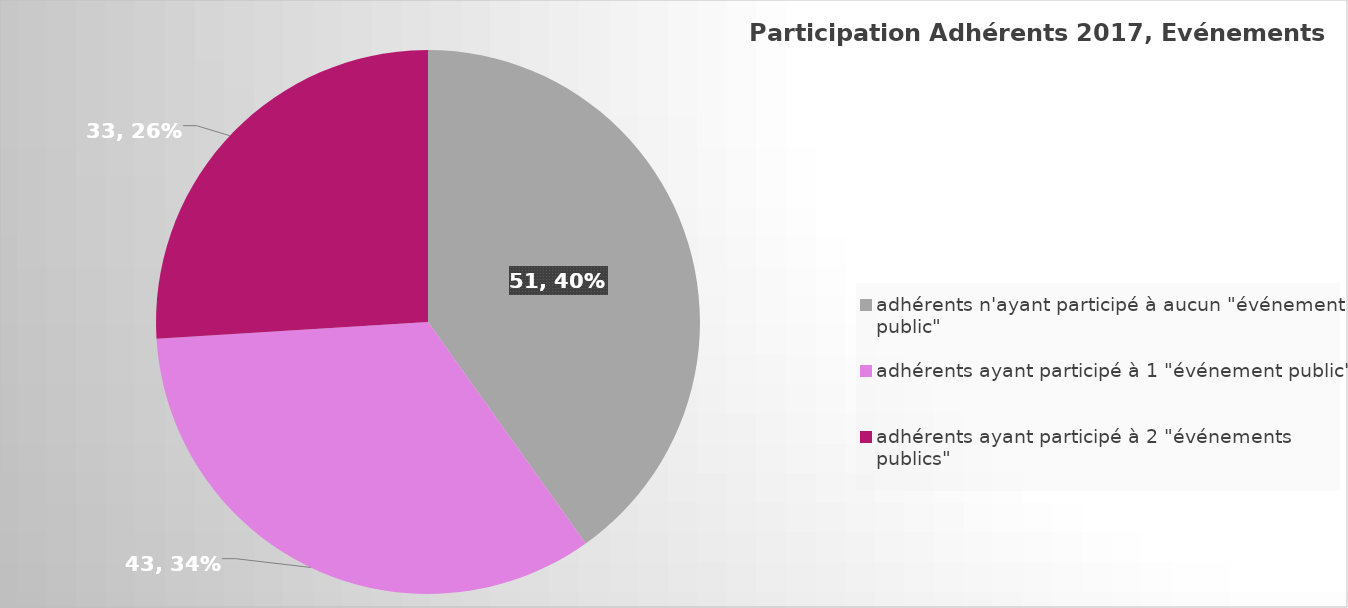
| Category | Series 0 | Series 1 |
|---|---|---|
| adhérents n'ayant participé à aucun "événement public" | 51 | 0.402 |
| adhérents ayant participé à 1 "événement public" | 43 | 0.339 |
| adhérents ayant participé à 2 "événements publics" | 33 | 0.26 |